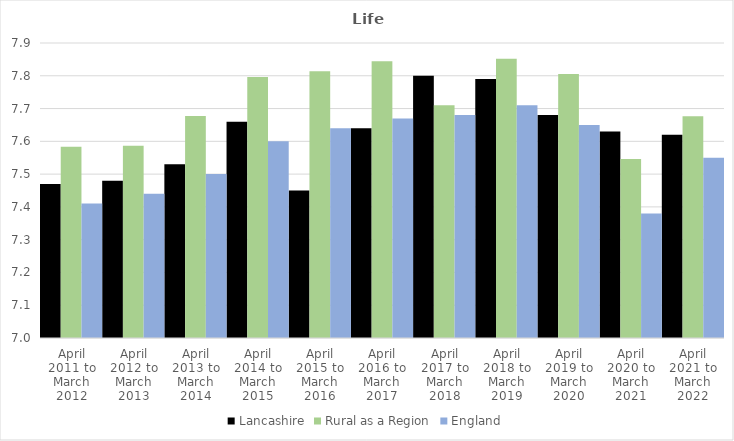
| Category | Lancashire | Rural as a Region | England |
|---|---|---|---|
| April 2011 to March 2012 | 7.47 | 7.584 | 7.41 |
| April 2012 to March 2013 | 7.48 | 7.586 | 7.44 |
| April 2013 to March 2014 | 7.53 | 7.677 | 7.5 |
| April 2014 to March 2015 | 7.66 | 7.797 | 7.6 |
| April 2015 to March 2016 | 7.45 | 7.813 | 7.64 |
| April 2016 to March 2017 | 7.64 | 7.845 | 7.67 |
| April 2017 to March 2018 | 7.8 | 7.71 | 7.68 |
| April 2018 to March 2019 | 7.79 | 7.852 | 7.71 |
| April 2019 to March 2020 | 7.68 | 7.806 | 7.65 |
| April 2020 to March 2021 | 7.63 | 7.546 | 7.38 |
| April 2021 to March 2022 | 7.62 | 7.677 | 7.55 |